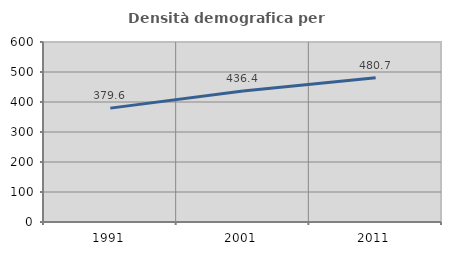
| Category | Densità demografica |
|---|---|
| 1991.0 | 379.607 |
| 2001.0 | 436.381 |
| 2011.0 | 480.712 |